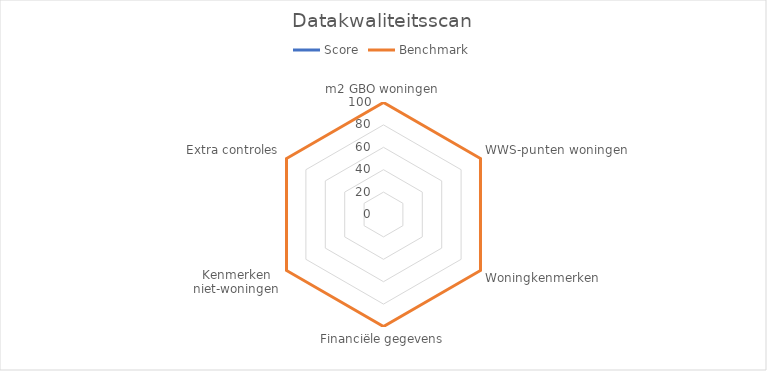
| Category | Score | Benchmark |
|---|---|---|
| m2 GBO woningen | 0 | 100 |
| WWS-punten woningen | 0 | 100 |
| Woningkenmerken | 0 | 100 |
| Financiële gegevens | 0 | 100 |
| Kenmerken niet-woningen | 0 | 100 |
| Extra controles | 0 | 100 |